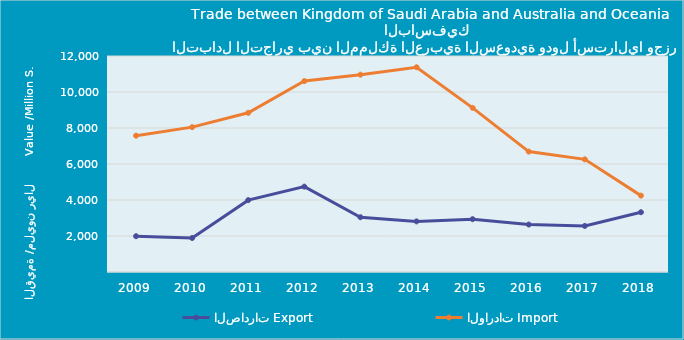
| Category | الصادرات | الواردات |
|---|---|---|
| 2009.0 | 1989430856 | 7572924237 |
| 2010.0 | 1889668285 | 8048279335 |
| 2011.0 | 3992682331 | 8843697237 |
| 2012.0 | 4741151889 | 10607402622 |
| 2013.0 | 3042564981 | 10963237325 |
| 2014.0 | 2811960625 | 11374150151 |
| 2015.0 | 2934836125 | 9119675680 |
| 2016.0 | 2636107734 | 6688587788 |
| 2017.0 | 2559429233 | 6258835768 |
| 2018.0 | 3320780721 | 4243252018 |